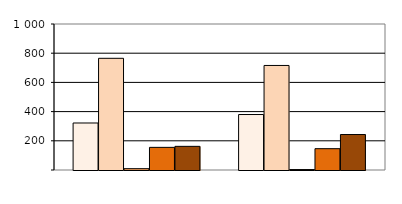
| Category | Series 0 | Series 1 | Series 2 | Series 3 | Series 4 |
|---|---|---|---|---|---|
| 0 | 322 | 765 | 9 | 155 | 162 |
| 1 | 380 | 716 | 3 | 146 | 243 |